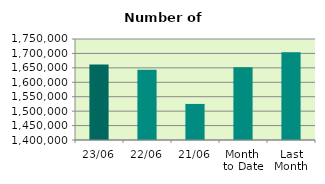
| Category | Series 0 |
|---|---|
| 23/06 | 1661946 |
| 22/06 | 1643152 |
| 21/06 | 1524980 |
| Month 
to Date | 1652431.294 |
| Last
Month | 1704183.545 |